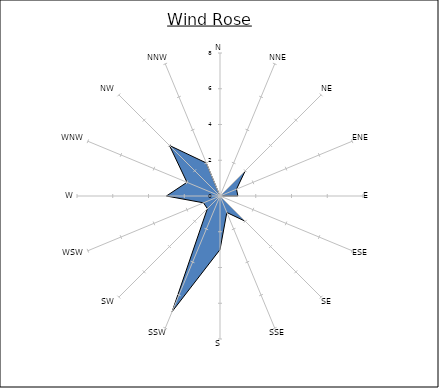
| Category | Series 0 |
|---|---|
| N | 0 |
| NNE | 0 |
| NE | 2 |
| ENE | 1 |
| E | 1 |
| ESE | 0 |
| SE | 2 |
| SSE | 1 |
| S | 3 |
| SSW | 7 |
| SW | 1 |
| WSW | 1 |
| W | 3 |
| WNW | 2 |
| NW | 4 |
| NNW | 2 |